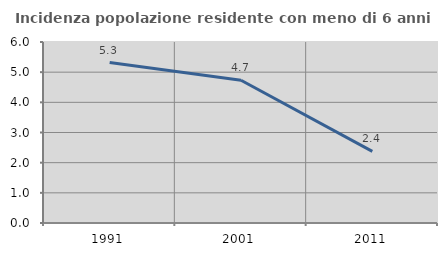
| Category | Incidenza popolazione residente con meno di 6 anni |
|---|---|
| 1991.0 | 5.317 |
| 2001.0 | 4.731 |
| 2011.0 | 2.375 |